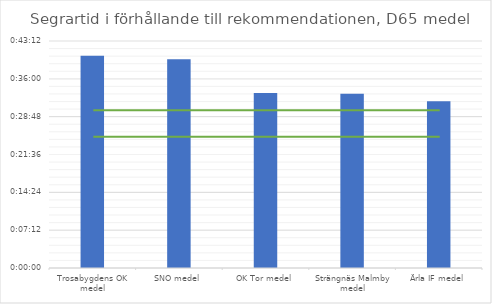
| Category | D65 tid |
|---|---|
| Trosabygdens OK medel | 0.028 |
| SNO medel | 0.028 |
| OK Tor medel | 0.023 |
| Strängnäs Malmby medel | 0.023 |
| Ärla IF medel | 0.022 |